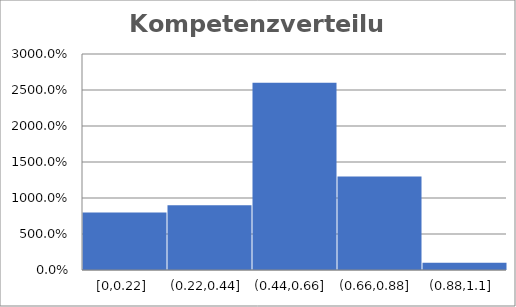
| Category | Series 0 |
|---|---|
| 0 | 0.075 |
| 1 | 0.105 |
| 2 | 0.14 |
| 3 | 0.215 |
| 4 | 0.23 |
| 5 | 0.306 |
| 6 | 0.747 |
| 7 | 0.729 |
| 8 | 0.522 |
| 9 | 0.333 |
| 10 | 0.054 |
| 11 | 0.243 |
| 12 | 0.81 |
| 13 | 0.297 |
| 14 | 0.279 |
| 15 | 0.216 |
| 16 | 0.648 |
| 17 | 0.498 |
| 18 | 0.504 |
| 19 | 0.462 |
| 20 | 0.462 |
| 21 | 0 |
| 22 | 0 |
| 23 | 0.81 |
| 24 | 0.672 |
| 25 | 0.81 |
| 26 | 0.81 |
| 27 | 0.486 |
| 28 | 0.558 |
| 29 | 0.738 |
| 30 | 0.63 |
| 31 | 0.558 |
| 32 | 0.459 |
| 33 | 0.504 |
| 34 | 0.264 |
| 35 | 0.513 |
| 36 | 0.4 |
| 37 | 0.684 |
| 38 | 0.504 |
| 39 | 0.423 |
| 40 | 0.999 |
| 41 | 0.567 |
| 42 | 0.585 |
| 43 | 0.45 |
| 44 | 0.531 |
| 45 | 0.531 |
| 46 | 0.468 |
| 47 | 0.792 |
| 48 | 0.774 |
| 49 | 0.81 |
| 50 | 0.657 |
| 51 | 0.81 |
| 52 | 0.585 |
| 53 | 0.468 |
| 54 | 0.504 |
| 55 | 0.63 |
| 56 | 0.594 |